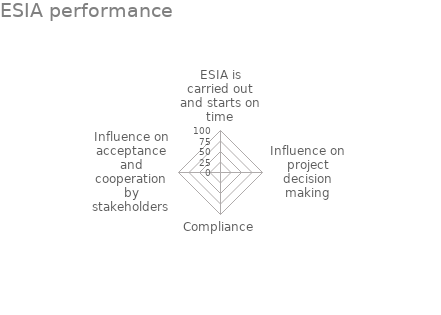
| Category | Series 0 |
|---|---|
| ESIA is carried out and starts on time | 0 |
| Influence on project decision making | 0 |
| Compliance | 0 |
| Influence on acceptance and cooperation by stakeholders | 0 |